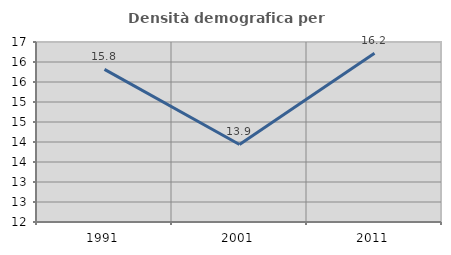
| Category | Densità demografica |
|---|---|
| 1991.0 | 15.815 |
| 2001.0 | 13.939 |
| 2011.0 | 16.217 |